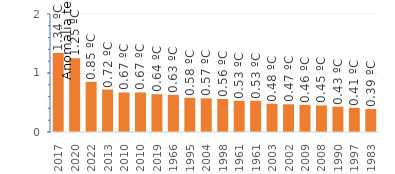
| Category | ANUAL |
|---|---|
| 2017.0 | 1.34 |
| 2020.0 | 1.25 |
| 2022.0 | 0.85 |
| 2013.0 | 0.72 |
| 2010.0 | 0.67 |
| 2010.0 | 0.67 |
| 2019.0 | 0.64 |
| 1966.0 | 0.63 |
| 1995.0 | 0.58 |
| 2004.0 | 0.57 |
| 1998.0 | 0.56 |
| 1961.0 | 0.53 |
| 1961.0 | 0.53 |
| 2003.0 | 0.48 |
| 2002.0 | 0.47 |
| 2009.0 | 0.46 |
| 2008.0 | 0.45 |
| 1990.0 | 0.43 |
| 1997.0 | 0.41 |
| 1983.0 | 0.39 |